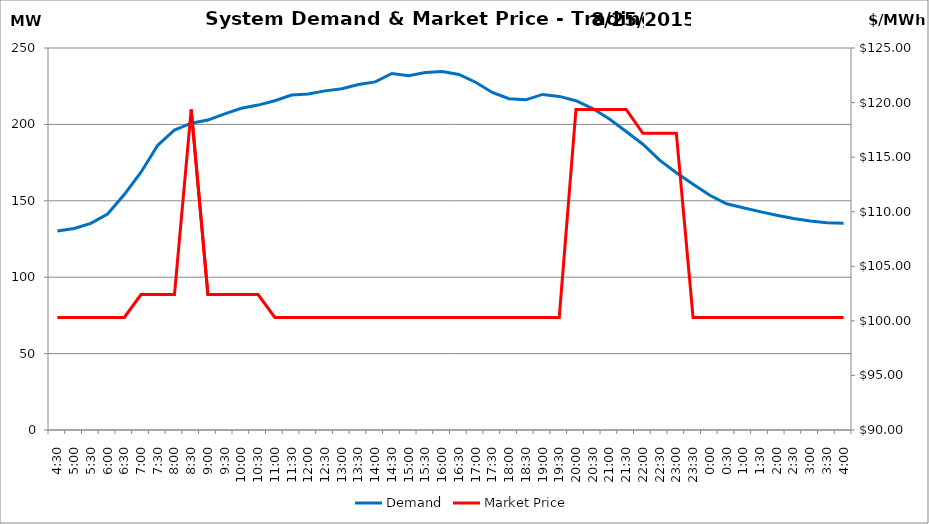
| Category | Demand |
|---|---|
| 0.1875 | 130.19 |
| 0.20833333333333334 | 131.89 |
| 0.22916666666666666 | 135.25 |
| 0.25 | 141.3 |
| 0.270833333333333 | 154.06 |
| 0.291666666666667 | 168.71 |
| 0.3125 | 186.32 |
| 0.333333333333333 | 196.33 |
| 0.354166666666667 | 200.78 |
| 0.375 | 202.83 |
| 0.395833333333333 | 206.91 |
| 0.416666666666667 | 210.54 |
| 0.4375 | 212.64 |
| 0.458333333333333 | 215.46 |
| 0.479166666666667 | 219.2 |
| 0.5 | 219.85 |
| 0.520833333333333 | 221.94 |
| 0.541666666666667 | 223.32 |
| 0.5625 | 226.14 |
| 0.583333333333333 | 227.84 |
| 0.604166666666667 | 233.34 |
| 0.625 | 231.81 |
| 0.645833333333334 | 233.92 |
| 0.666666666666667 | 234.6 |
| 0.6875 | 232.65 |
| 0.708333333333334 | 227.58 |
| 0.729166666666667 | 220.9 |
| 0.75 | 216.85 |
| 0.770833333333334 | 216.09 |
| 0.791666666666667 | 219.61 |
| 0.8125 | 218.33 |
| 0.833333333333334 | 215.5 |
| 0.854166666666667 | 210.39 |
| 0.875 | 203.57 |
| 0.895833333333334 | 195.4 |
| 0.916666666666667 | 187.04 |
| 0.9375 | 176.62 |
| 0.958333333333334 | 168.41 |
| 0.979166666666667 | 160.89 |
| 1900-01-01 | 153.62 |
| 1900-01-01 00:30:00 | 148.07 |
| 1900-01-01 01:00:00 | 145.43 |
| 1900-01-01 01:30:00 | 142.91 |
| 1900-01-01 02:00:00 | 140.55 |
| 1900-01-01 02:30:00 | 138.37 |
| 1900-01-01 03:00:00 | 136.71 |
| 1900-01-01 03:30:00 | 135.69 |
| 1900-01-01 04:00:00 | 135.31 |